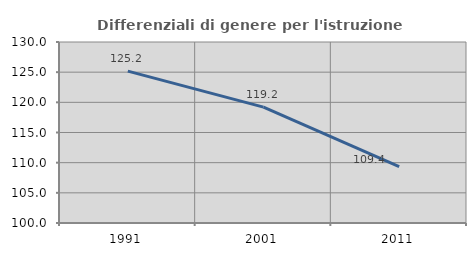
| Category | Differenziali di genere per l'istruzione superiore |
|---|---|
| 1991.0 | 125.176 |
| 2001.0 | 119.203 |
| 2011.0 | 109.362 |